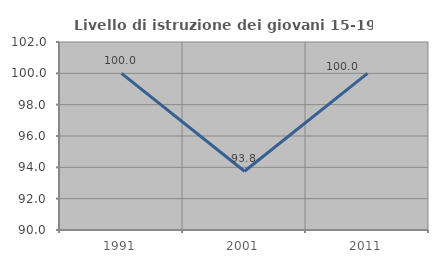
| Category | Livello di istruzione dei giovani 15-19 anni |
|---|---|
| 1991.0 | 100 |
| 2001.0 | 93.75 |
| 2011.0 | 100 |